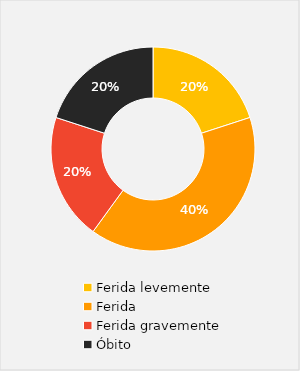
| Category | Series 0 |
|---|---|
| Ferida levemente | 1 |
| Ferida | 2 |
| Ferida gravemente | 1 |
| Óbito | 1 |